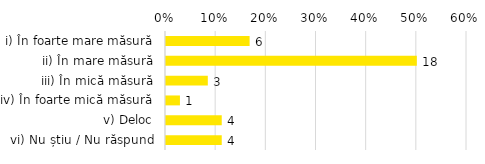
| Category | Total |
|---|---|
| i) În foarte mare măsură | 0.167 |
| ii) În mare măsură | 0.5 |
| iii) În mică măsură | 0.083 |
| iv) În foarte mică măsură | 0.028 |
| v) Deloc | 0.111 |
| vi) Nu știu / Nu răspund | 0.111 |